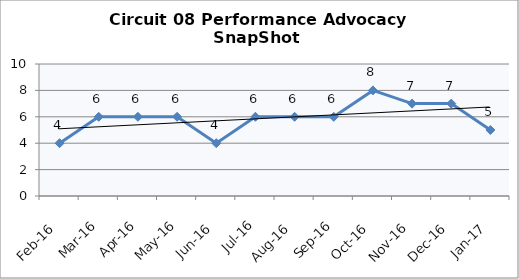
| Category | Circuit 08 |
|---|---|
| Feb-16 | 4 |
| Mar-16 | 6 |
| Apr-16 | 6 |
| May-16 | 6 |
| Jun-16 | 4 |
| Jul-16 | 6 |
| Aug-16 | 6 |
| Sep-16 | 6 |
| Oct-16 | 8 |
| Nov-16 | 7 |
| Dec-16 | 7 |
| Jan-17 | 5 |